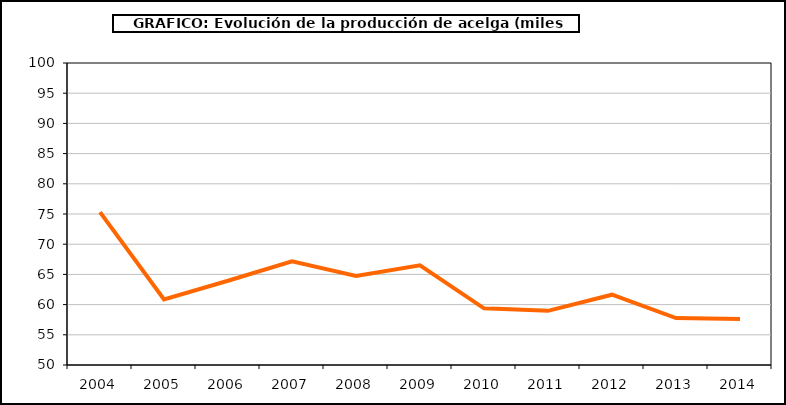
| Category | producción |
|---|---|
| 2004.0 | 75.318 |
| 2005.0 | 60.842 |
| 2006.0 | 63.947 |
| 2007.0 | 67.16 |
| 2008.0 | 64.735 |
| 2009.0 | 66.495 |
| 2010.0 | 59.386 |
| 2011.0 | 58.965 |
| 2012.0 | 61.638 |
| 2013.0 | 57.773 |
| 2014.0 | 57.619 |